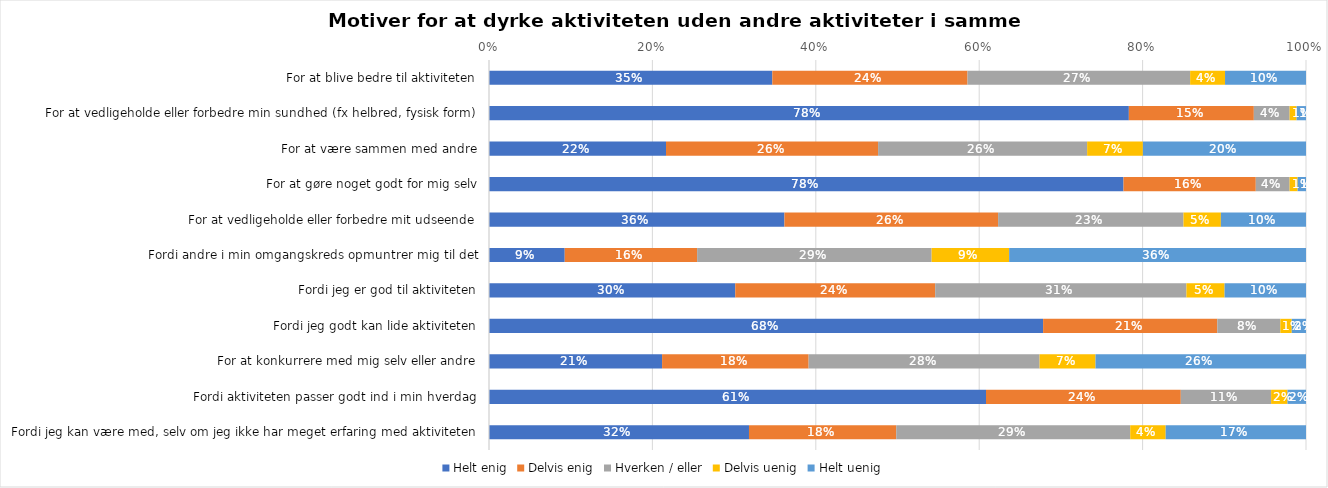
| Category | Helt enig | Delvis enig | Hverken / eller | Delvis uenig | Helt uenig |
|---|---|---|---|---|---|
| For at blive bedre til aktiviteten | 0.347 | 0.239 | 0.272 | 0.043 | 0.099 |
| For at vedligeholde eller forbedre min sundhed (fx helbred, fysisk form) | 0.783 | 0.153 | 0.044 | 0.008 | 0.012 |
| For at være sammen med andre | 0.217 | 0.26 | 0.256 | 0.068 | 0.2 |
| For at gøre noget godt for mig selv | 0.777 | 0.162 | 0.041 | 0.01 | 0.01 |
| For at vedligeholde eller forbedre mit udseende | 0.362 | 0.262 | 0.227 | 0.046 | 0.104 |
| Fordi andre i min omgangskreds opmuntrer mig til det | 0.093 | 0.162 | 0.287 | 0.095 | 0.363 |
| Fordi jeg er god til aktiviteten | 0.301 | 0.245 | 0.308 | 0.047 | 0.1 |
| Fordi jeg godt kan lide aktiviteten | 0.678 | 0.213 | 0.077 | 0.014 | 0.017 |
| For at konkurrere med mig selv eller andre | 0.212 | 0.179 | 0.283 | 0.068 | 0.258 |
| Fordi aktiviteten passer godt ind i min hverdag | 0.608 | 0.238 | 0.111 | 0.02 | 0.023 |
| Fordi jeg kan være med, selv om jeg ikke har meget erfaring med aktiviteten | 0.318 | 0.18 | 0.286 | 0.043 | 0.172 |